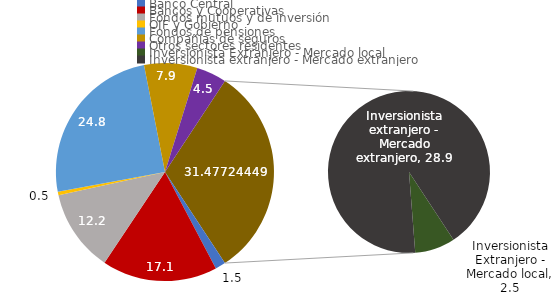
| Category | Series 0 |
|---|---|
| Banco Central | 1.537 |
| Bancos y Cooperativas | 17.097 |
| Fondos mutuos y de inversión | 12.195 |
| OIF y Gobierno | 0.549 |
| Fondos de pensiones | 24.799 |
| Compañias de seguros | 7.878 |
| Otros sectores residentes | 4.469 |
| Inversionista Extranjero - Mercado local | 2.528 |
| Inversionista extranjero - Mercado extranjero | 28.95 |